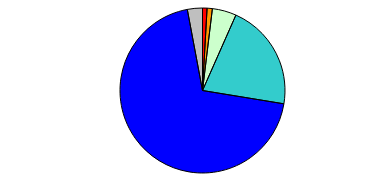
| Category | Series 0 |
|---|---|
| 0 | 6 |
| 1 | 7 |
| 2 | 32 |
| 3 | 142 |
| 4 | 471 |
| 5 | 20 |